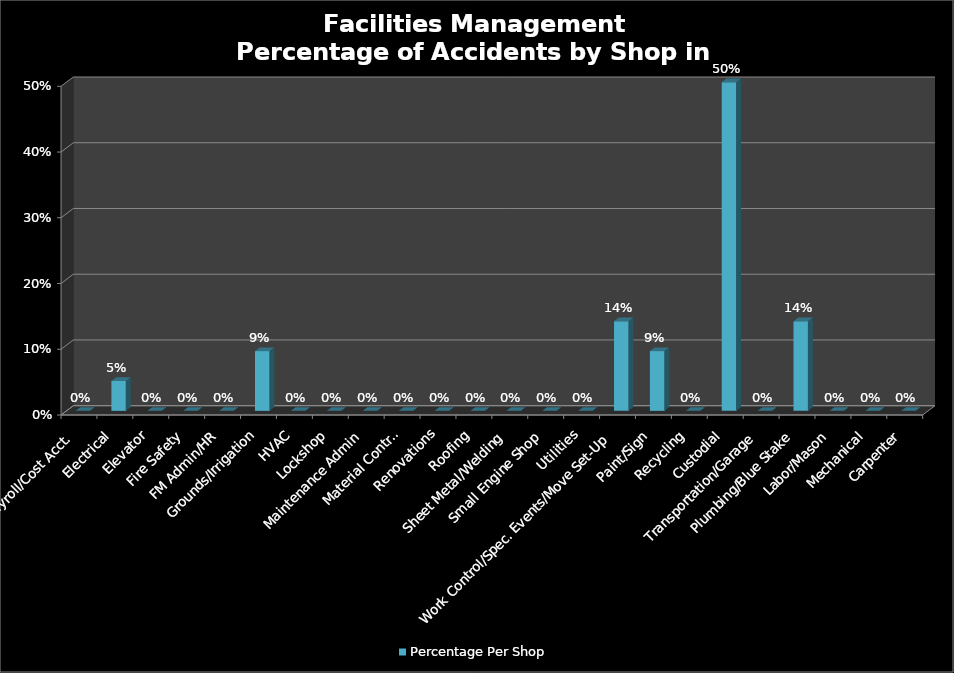
| Category | Percentage Per Shop |
|---|---|
| Bus Serv/IT/Payroll/Cost Acct. | 0 |
| Electrical | 0.045 |
| Elevator | 0 |
| Fire Safety | 0 |
| FM Admin/HR | 0 |
| Grounds/Irrigation | 0.091 |
| HVAC | 0 |
| Lockshop | 0 |
| Maintenance Admin | 0 |
| Material Control | 0 |
| Renovations | 0 |
| Roofing | 0 |
| Sheet Metal/Welding | 0 |
| Small Engine Shop | 0 |
| Utilities | 0 |
| Work Control/Spec. Events/Move Set-Up | 0.136 |
| Paint/Sign | 0.091 |
| Recycling | 0 |
| Custodial | 0.5 |
| Transportation/Garage | 0 |
| Plumbing/Blue Stake | 0.136 |
| Labor/Mason | 0 |
| Mechanical | 0 |
| Carpenter | 0 |